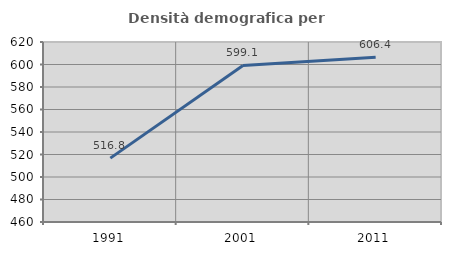
| Category | Densità demografica |
|---|---|
| 1991.0 | 516.79 |
| 2001.0 | 599.134 |
| 2011.0 | 606.424 |